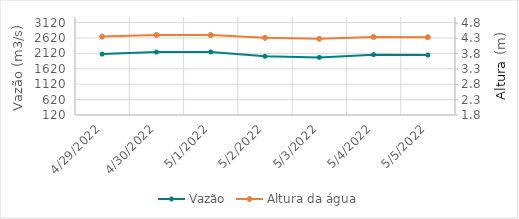
| Category | Vazão |
|---|---|
| 4/24/22 | 3075.38 |
| 4/23/22 | 2891.8 |
| 4/22/22 | 2544.51 |
| 4/21/22 | 2377.31 |
| 4/20/22 | 2346.67 |
| 4/19/22 | 2298.54 |
| 4/18/22 | 2252.29 |